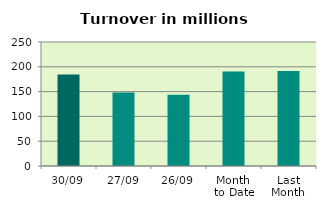
| Category | Series 0 |
|---|---|
| 30/09 | 184.283 |
| 27/09 | 148.121 |
| 26/09 | 143.794 |
| Month 
to Date | 190.73 |
| Last
Month | 191.512 |